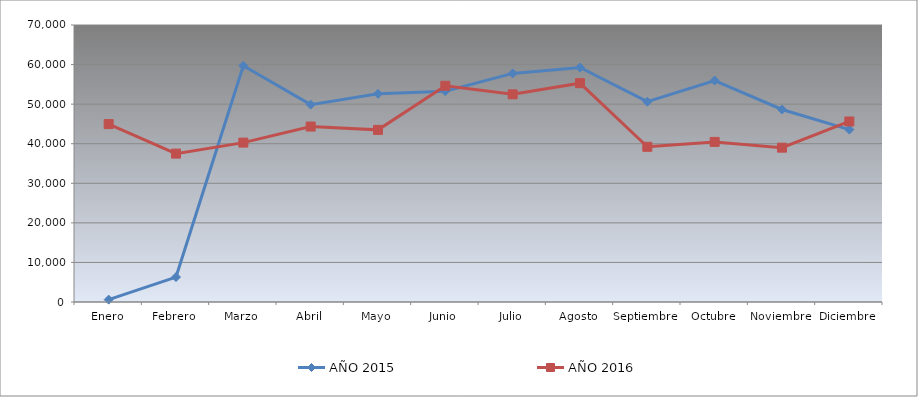
| Category | AÑO 2015 | AÑO 2016 |
|---|---|---|
| Enero | 600 | 44960 |
| Febrero | 6300 | 37500 |
| Marzo | 59700 | 40280 |
| Abril | 49880.895 | 44340 |
| Mayo | 52606.798 | 43500 |
| Junio | 53275.219 | 54640 |
| Julio | 57766.17 | 52480 |
| Agosto | 59259.673 | 55300 |
| Septiembre | 50622.424 | 39220 |
| Octubre | 55969.79 | 40460 |
| Noviembre | 48648.494 | 39000 |
| Diciembre | 43572.674 | 45620 |